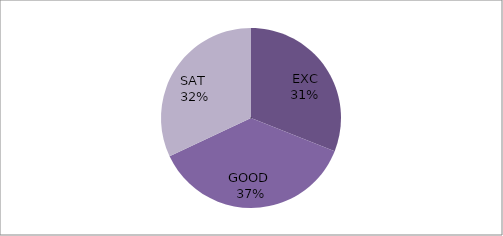
| Category | Series 0 |
|---|---|
| EXC | 31 |
| GOOD  | 37 |
| SAT  | 32 |